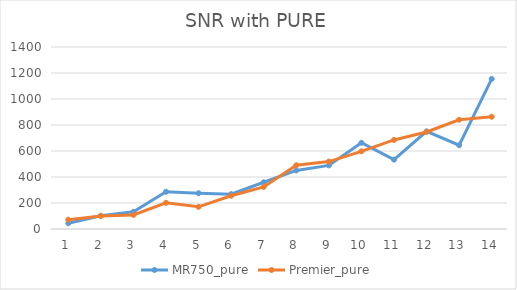
| Category | MR750_pure | Premier_pure |
|---|---|---|
| 0 | 43.939 | 71.61 |
| 1 | 102.026 | 100.328 |
| 2 | 132.359 | 108.133 |
| 3 | 286.625 | 201.402 |
| 4 | 275.346 | 170.548 |
| 5 | 268.17 | 255.607 |
| 6 | 359.403 | 323.991 |
| 7 | 450.288 | 490.279 |
| 8 | 489.407 | 518.717 |
| 9 | 663.256 | 597.388 |
| 10 | 533.524 | 685.099 |
| 11 | 751.306 | 745.948 |
| 12 | 644.398 | 840.483 |
| 13 | 1154.356 | 863.617 |